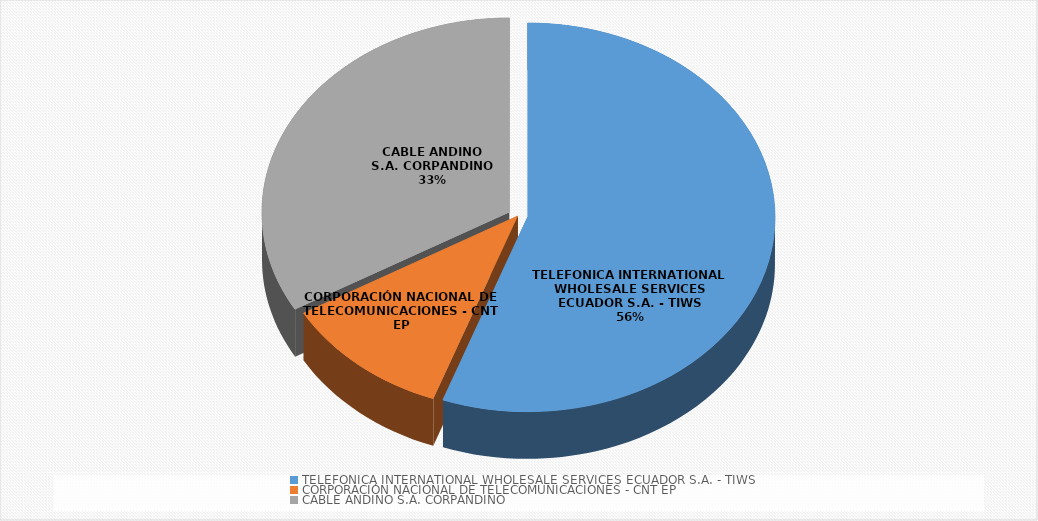
| Category | Series 0 |
|---|---|
| TELEFONICA INTERNATIONAL WHOLESALE SERVICES ECUADOR S.A. - TIWS | 5 |
| CORPORACIÓN NACIONAL DE TELECOMUNICACIONES - CNT EP | 1 |
| CABLE ANDINO S.A. CORPANDINO | 3 |